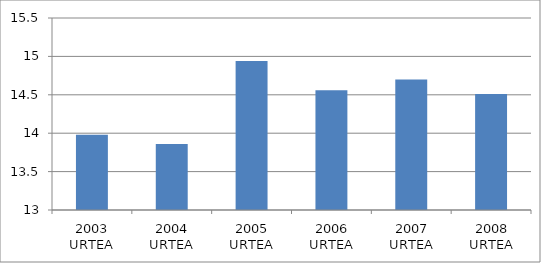
| Category | Series 0 |
|---|---|
| 2003 URTEA | 13.98 |
| 2004 URTEA | 13.86 |
| 2005 URTEA | 14.94 |
| 2006 URTEA | 14.56 |
| 2007 URTEA | 14.7 |
| 2008 URTEA | 14.51 |